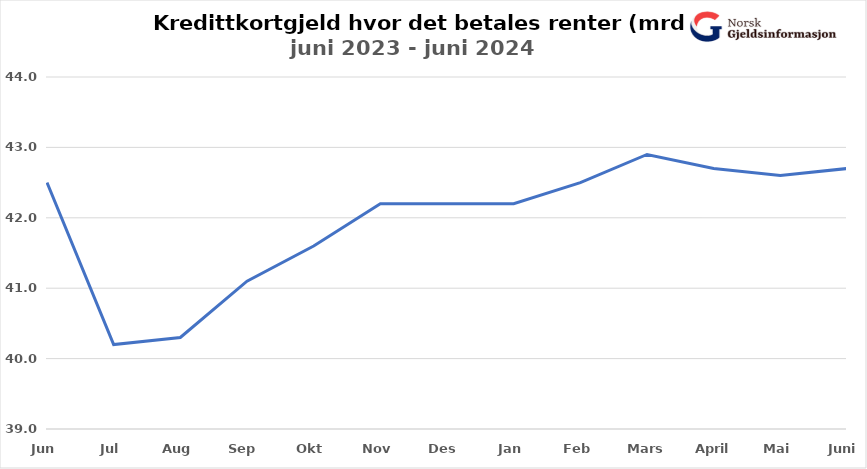
| Category | Rentebærende rammekreditt |
|---|---|
| Jun | 42.5 |
| Jul | 40.2 |
| Aug | 40.3 |
| Sep | 41.1 |
| Okt | 41.6 |
| Nov | 42.2 |
| Des | 42.2 |
| Jan | 42.2 |
| Feb | 42.5 |
| Mars | 42.9 |
| April | 42.7 |
| Mai | 42.6 |
| Juni | 42.7 |